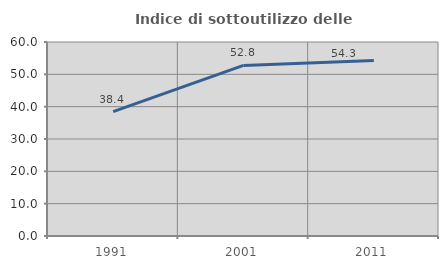
| Category | Indice di sottoutilizzo delle abitazioni  |
|---|---|
| 1991.0 | 38.447 |
| 2001.0 | 52.761 |
| 2011.0 | 54.316 |